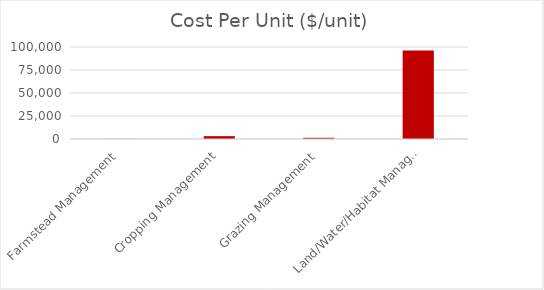
| Category | $ |
|---|---|
| Farmstead Management | 159.273 |
| Cropping Management | 3102.537 |
| Grazing Management | 1315.979 |
| Land/Water/Habitat Management | 96318.36 |